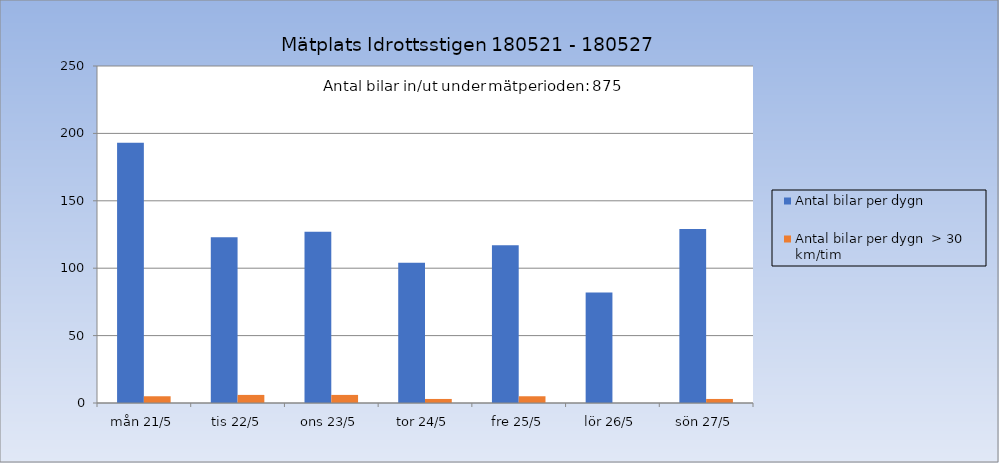
| Category | Antal bilar per dygn | Antal bilar per dygn  > 30 km/tim |
|---|---|---|
| mån 21/5 | 193 | 5 |
| tis 22/5 | 123 | 6 |
| ons 23/5 | 127 | 6 |
| tor 24/5 | 104 | 3 |
| fre 25/5 | 117 | 5 |
| lör 26/5 | 82 | 0 |
| sön 27/5 | 129 | 3 |